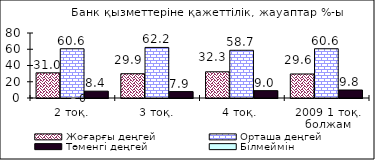
| Category | Жоғарғы деңгей | Орташа деңгей | Төменгі деңгей |
|---|---|---|---|
| 2 тоқ. | 30.98 | 60.6 | 8.42 |
| 3 тоқ. | 29.88 | 62.24 | 7.89 |
| 4 тоқ.  | 32.25 | 58.72 | 9.03 |
| 2009 1 тоқ. болжам | 29.56 | 60.61 | 9.83 |